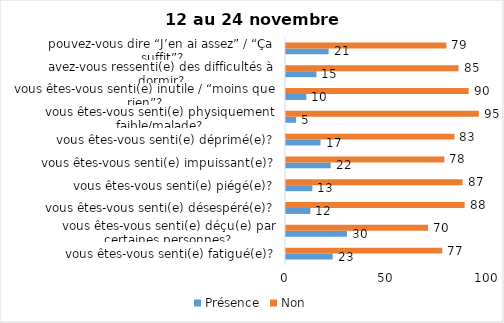
| Category | Présence | Non |
|---|---|---|
| vous êtes-vous senti(e) fatigué(e)? | 23 | 77 |
| vous êtes-vous senti(e) déçu(e) par certaines personnes? | 30 | 70 |
| vous êtes-vous senti(e) désespéré(e)? | 12 | 88 |
| vous êtes-vous senti(e) piégé(e)? | 13 | 87 |
| vous êtes-vous senti(e) impuissant(e)? | 22 | 78 |
| vous êtes-vous senti(e) déprimé(e)? | 17 | 83 |
| vous êtes-vous senti(e) physiquement faible/malade? | 5 | 95 |
| vous êtes-vous senti(e) inutile / “moins que rien”? | 10 | 90 |
| avez-vous ressenti(e) des difficultés à dormir? | 15 | 85 |
| pouvez-vous dire “J’en ai assez” / “Ça suffit”? | 21 | 79 |